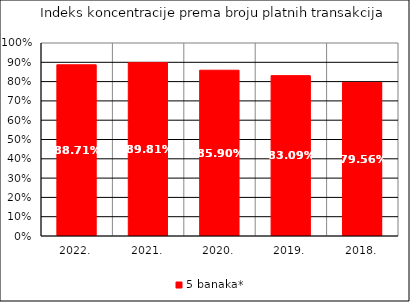
| Category | 5 banaka* |
|---|---|
| 2022. | 0.887 |
| 2021. | 0.898 |
| 2020. | 0.859 |
| 2019. | 0.831 |
| 2018. | 0.796 |